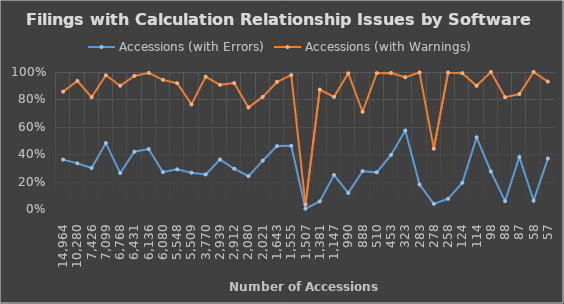
| Category | Accessions (with Errors) | Accessions (with Warnings) |
|---|---|---|
| 14964.0 | 0.361 | 0.857 |
| 10280.0 | 0.333 | 0.934 |
| 7426.0 | 0.3 | 0.816 |
| 7099.0 | 0.481 | 0.976 |
| 6768.0 | 0.262 | 0.9 |
| 6431.0 | 0.418 | 0.971 |
| 6136.0 | 0.438 | 0.994 |
| 6080.0 | 0.27 | 0.942 |
| 5548.0 | 0.289 | 0.919 |
| 5509.0 | 0.265 | 0.764 |
| 3770.0 | 0.252 | 0.965 |
| 2939.0 | 0.361 | 0.906 |
| 2912.0 | 0.294 | 0.919 |
| 2080.0 | 0.24 | 0.741 |
| 2021.0 | 0.353 | 0.818 |
| 1643.0 | 0.459 | 0.927 |
| 1555.0 | 0.461 | 0.978 |
| 1507.0 | 0.002 | 0.034 |
| 1381.0 | 0.055 | 0.871 |
| 1147.0 | 0.248 | 0.818 |
| 990.0 | 0.117 | 0.99 |
| 888.0 | 0.276 | 0.71 |
| 510.0 | 0.267 | 0.992 |
| 453.0 | 0.394 | 0.993 |
| 323.0 | 0.573 | 0.962 |
| 283.0 | 0.178 | 0.996 |
| 278.0 | 0.037 | 0.44 |
| 258.0 | 0.074 | 0.996 |
| 124.0 | 0.192 | 0.992 |
| 114.0 | 0.523 | 0.899 |
| 98.0 | 0.274 | 1 |
| 88.0 | 0.057 | 0.816 |
| 87.0 | 0.379 | 0.839 |
| 58.0 | 0.061 | 1 |
| 57.0 | 0.368 | 0.93 |